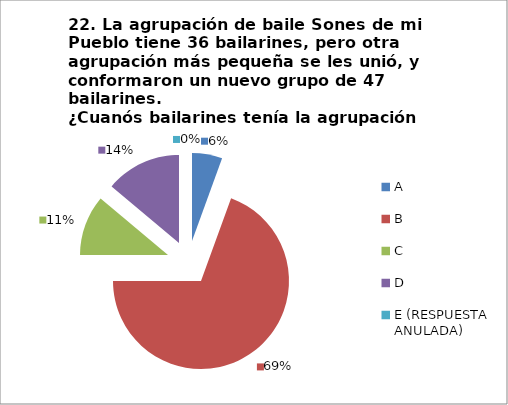
| Category | CANTIDAD DE RESPUESTAS PREGUNTA (22) | PORCENTAJE |
|---|---|---|
| A | 2 | 0.056 |
| B | 25 | 0.694 |
| C | 4 | 0.111 |
| D | 5 | 0.139 |
| E (RESPUESTA ANULADA) | 0 | 0 |